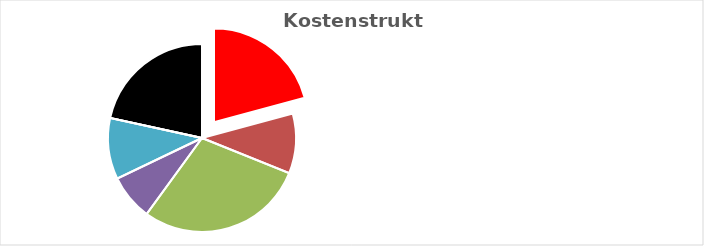
| Category | Series 0 |
|---|---|
| KV-Entgelt produktiv Tätige | 1 |
| Weitere Personalkosten produktiv | 0.496 |
| Personalnebenkosten | 1.391 |
| Unproduktives Personal | 0.379 |
| Deckung Personalgemeinkosten | 0.507 |
| Umlagen ohne GZ | 0 |
| Gesamtzuschlag | 1.038 |